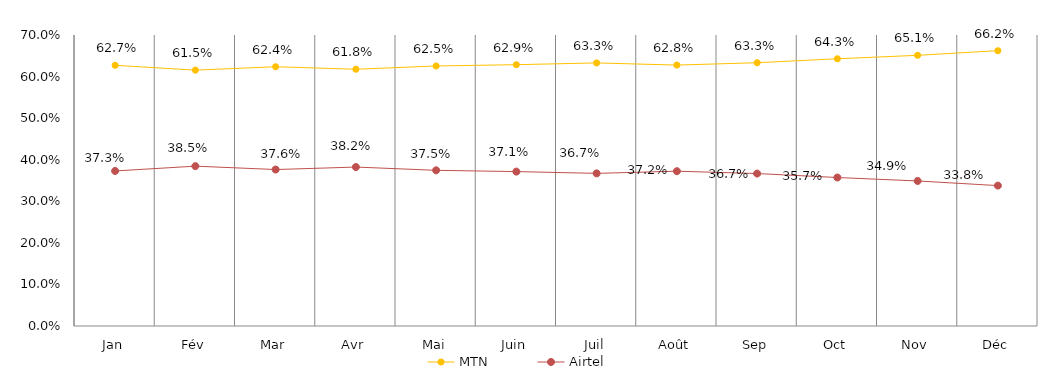
| Category | MTN | Airtel |
|---|---|---|
| Jan | 0.627 | 0.373 |
| Fév | 0.615 | 0.385 |
| Mar | 0.624 | 0.376 |
| Avr | 0.618 | 0.382 |
| Mai | 0.625 | 0.375 |
| Juin | 0.629 | 0.371 |
| Juil | 0.633 | 0.367 |
| Août | 0.628 | 0.372 |
| Sep | 0.633 | 0.367 |
| Oct | 0.643 | 0.357 |
| Nov | 0.651 | 0.349 |
| Déc | 0.662 | 0.338 |